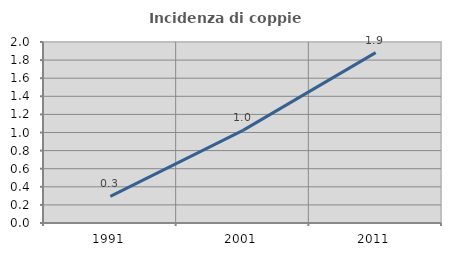
| Category | Incidenza di coppie miste |
|---|---|
| 1991.0 | 0.295 |
| 2001.0 | 1.023 |
| 2011.0 | 1.882 |